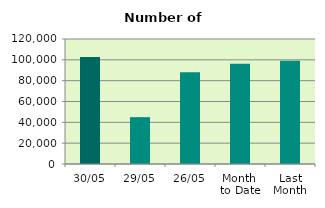
| Category | Series 0 |
|---|---|
| 30/05 | 102788 |
| 29/05 | 44972 |
| 26/05 | 88140 |
| Month 
to Date | 96139.238 |
| Last
Month | 99222.444 |